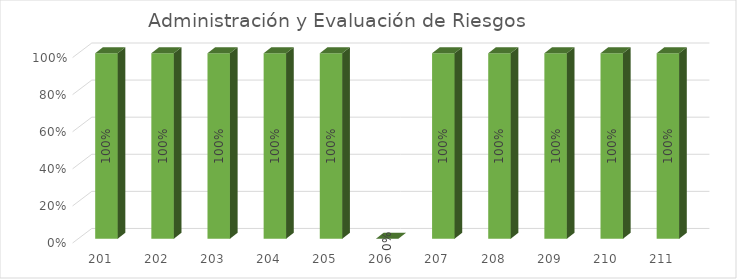
| Category | % Avance |
|---|---|
| 201.0 | 1 |
| 202.0 | 1 |
| 203.0 | 1 |
| 204.0 | 1 |
| 205.0 | 1 |
| 206.0 | 0 |
| 207.0 | 1 |
| 208.0 | 1 |
| 209.0 | 1 |
| 210.0 | 1 |
| 211.0 | 1 |